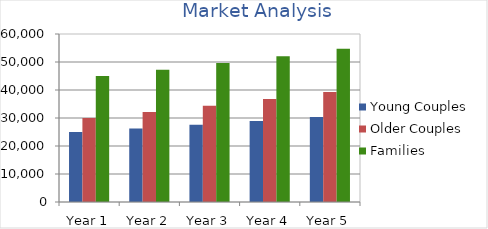
| Category | Young Couples | Older Couples | Families |
|---|---|---|---|
| Year 1 | 25000 | 30000 | 45000 |
| Year 2 | 26250 | 32100 | 47250 |
| Year 3 | 27563 | 34347 | 49613 |
| Year 4 | 28941 | 36751 | 52094 |
| Year 5 | 30388 | 39324 | 54699 |